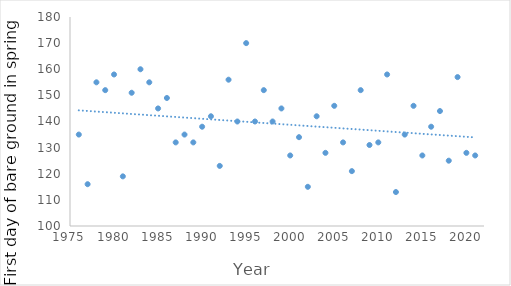
| Category | total days ground covered in snow |
|---|---|
| 1976.0 | 135 |
| 1977.0 | 116 |
| 1978.0 | 155 |
| 1979.0 | 152 |
| 1980.0 | 158 |
| 1981.0 | 119 |
| 1982.0 | 151 |
| 1983.0 | 160 |
| 1984.0 | 155 |
| 1985.0 | 145 |
| 1986.0 | 149 |
| 1987.0 | 132 |
| 1988.0 | 135 |
| 1989.0 | 132 |
| 1990.0 | 138 |
| 1991.0 | 142 |
| 1992.0 | 123 |
| 1993.0 | 156 |
| 1994.0 | 140 |
| 1995.0 | 170 |
| 1996.0 | 140 |
| 1997.0 | 152 |
| 1998.0 | 140 |
| 1999.0 | 145 |
| 2000.0 | 127 |
| 2001.0 | 134 |
| 2002.0 | 115 |
| 2003.0 | 142 |
| 2004.0 | 128 |
| 2005.0 | 146 |
| 2006.0 | 132 |
| 2007.0 | 121 |
| 2008.0 | 152 |
| 2009.0 | 131 |
| 2010.0 | 132 |
| 2011.0 | 158 |
| 2012.0 | 113 |
| 2013.0 | 135 |
| 2014.0 | 146 |
| 2015.0 | 127 |
| 2016.0 | 138 |
| 2017.0 | 144 |
| 2018.0 | 125 |
| 2019.0 | 157 |
| 2020.0 | 128 |
| 2021.0 | 127 |